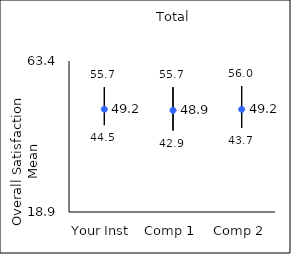
| Category | 25th percentile | 75th percentile | Mean |
|---|---|---|---|
| Your Inst | 44.5 | 55.7 | 49.19 |
| Comp 1 | 42.9 | 55.7 | 48.86 |
| Comp 2 | 43.7 | 56 | 49.15 |